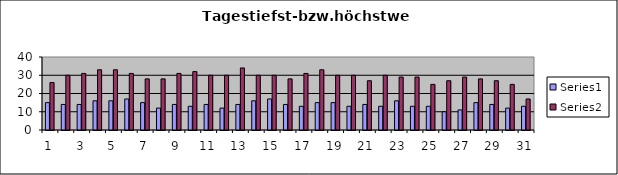
| Category | Series 0 | Series 1 |
|---|---|---|
| 0 | 15 | 26 |
| 1 | 14 | 30 |
| 2 | 14 | 31 |
| 3 | 16 | 33 |
| 4 | 16 | 33 |
| 5 | 17 | 31 |
| 6 | 15 | 28 |
| 7 | 12 | 28 |
| 8 | 14 | 31 |
| 9 | 13 | 32 |
| 10 | 14 | 30 |
| 11 | 12 | 30 |
| 12 | 14 | 34 |
| 13 | 16 | 30 |
| 14 | 17 | 30 |
| 15 | 14 | 28 |
| 16 | 13 | 31 |
| 17 | 15 | 33 |
| 18 | 15 | 30 |
| 19 | 13 | 30 |
| 20 | 14 | 27 |
| 21 | 13 | 30 |
| 22 | 16 | 29 |
| 23 | 13 | 29 |
| 24 | 13 | 25 |
| 25 | 10 | 27 |
| 26 | 11 | 29 |
| 27 | 15 | 28 |
| 28 | 14 | 27 |
| 29 | 12 | 25 |
| 30 | 13 | 17 |